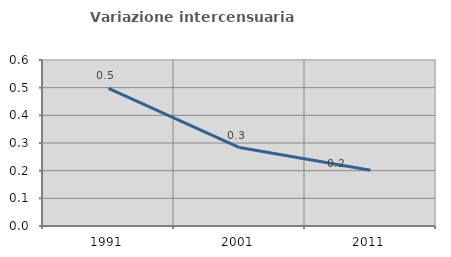
| Category | Variazione intercensuaria annua |
|---|---|
| 1991.0 | 0.498 |
| 2001.0 | 0.283 |
| 2011.0 | 0.202 |